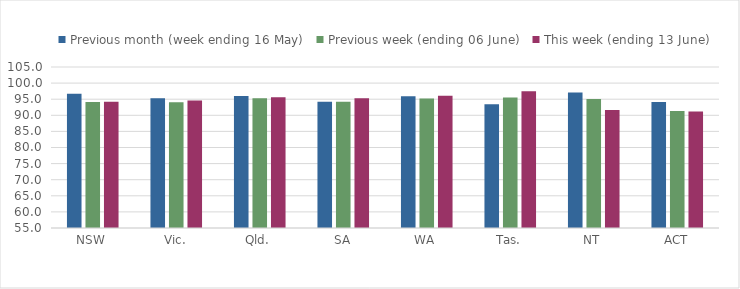
| Category | Previous month (week ending 16 May) | Previous week (ending 06 June) | This week (ending 13 June) |
|---|---|---|---|
| NSW | 96.679 | 94.11 | 94.231 |
| Vic. | 95.301 | 94.091 | 94.605 |
| Qld. | 95.994 | 95.261 | 95.618 |
| SA | 94.212 | 94.183 | 95.265 |
| WA | 95.912 | 95.208 | 96.079 |
| Tas. | 93.445 | 95.515 | 97.484 |
| NT | 97.048 | 95.038 | 91.685 |
| ACT | 94.105 | 91.339 | 91.162 |